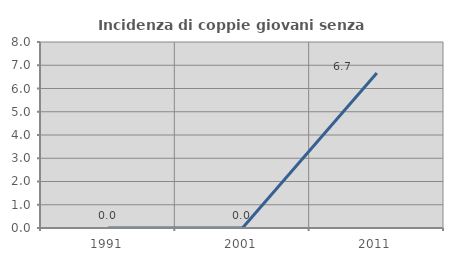
| Category | Incidenza di coppie giovani senza figli |
|---|---|
| 1991.0 | 0 |
| 2001.0 | 0 |
| 2011.0 | 6.667 |